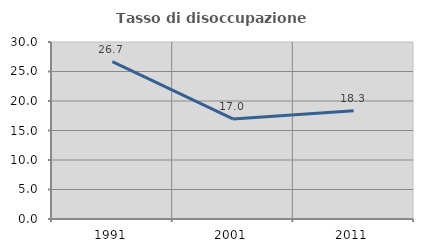
| Category | Tasso di disoccupazione giovanile  |
|---|---|
| 1991.0 | 26.667 |
| 2001.0 | 16.97 |
| 2011.0 | 18.349 |